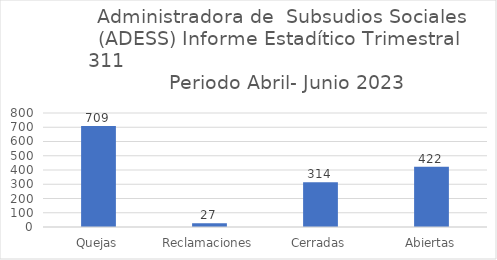
| Category | Series 0 |
|---|---|
| Quejas | 709 |
| Reclamaciones | 27 |
| Cerradas | 314 |
| Abiertas | 422 |